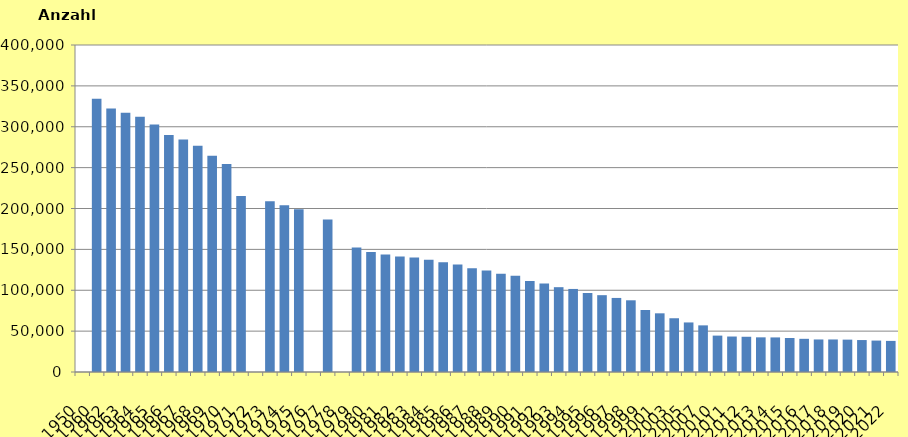
| Category | insgesamt |
|---|---|
| 1950.0 | 0 |
| 1960.0 | 334241 |
| 1962.0 | 322340 |
| 1963.0 | 317208 |
| 1964.0 | 312167 |
| 1965.0 | 302808 |
| 1966.0 | 289930 |
| 1967.0 | 284339 |
| 1968.0 | 276807 |
| 1969.0 | 264632 |
| 1970.0 | 254378 |
| 1971.0 | 215430 |
| 1972.0 | 0 |
| 1973.0 | 208920 |
| 1974.0 | 203852 |
| 1975.0 | 198989 |
| 1976.0 | 0 |
| 1977.0 | 186484 |
| 1978.0 | 0 |
| 1979.0 | 152265 |
| 1980.0 | 146767 |
| 1981.0 | 143811 |
| 1982.0 | 141132 |
| 1983.0 | 139998 |
| 1984.0 | 137242 |
| 1985.0 | 134279 |
| 1986.0 | 131465 |
| 1987.0 | 126836 |
| 1988.0 | 124200 |
| 1989.0 | 120131 |
| 1990.0 | 117634 |
| 1991.0 | 111243 |
| 1992.0 | 108332 |
| 1993.0 | 103757 |
| 1994.0 | 101596 |
| 1995.0 | 96642 |
| 1996.0 | 93976 |
| 1997.0 | 90595 |
| 1998.0 | 87715 |
| 1999.0 | 75850 |
| 2001.0 | 71781 |
| 2003.0 | 65753 |
| 2005.0 | 60617 |
| 2007.0 | 57049 |
| 2010.0 | 44512 |
| 2011.0 | 43400 |
| 2012.0 | 43100 |
| 2013.0 | 42400 |
| 2014.0 | 42300 |
| 2015.0 | 41600 |
| 2016.0 | 40589 |
| 2017.0 | 39800 |
| 2018.0 | 39800 |
| 2019.0 | 39590 |
| 2020.0 | 39085 |
| 2021.0 | 38440 |
| 2022.0 | 38040 |